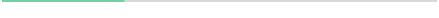
| Category | Series 0 |
|---|---|
| 0 | 0.279 |